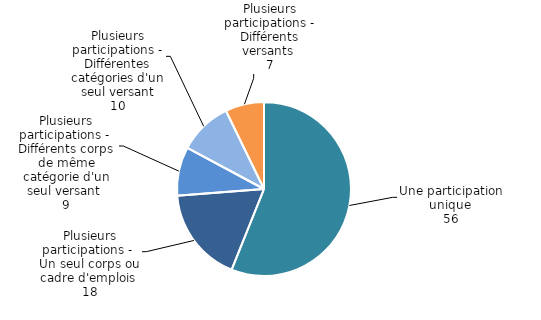
| Category | Series 0 |
|---|---|
| Une participation unique | 56.07 |
| Plusieurs participations - 
Un seul corps ou cadre d'emplois | 17.701 |
| Plusieurs participations - 
Différents corps de même catégorie d'un seul versant | 9.049 |
| Plusieurs participations - 
Différentes catégories d'un seul versant | 9.966 |
| Plusieurs participations - 
Différents versants | 7.214 |